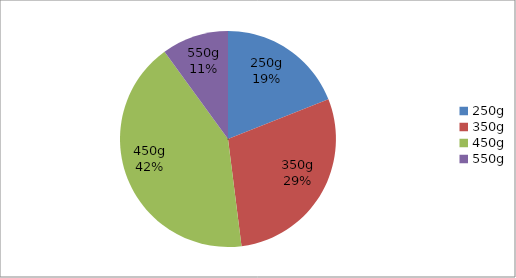
| Category | Series 0 |
|---|---|
| 250g | 53.2 |
| 350g | 81.2 |
| 450g | 117.6 |
| 550g | 28 |